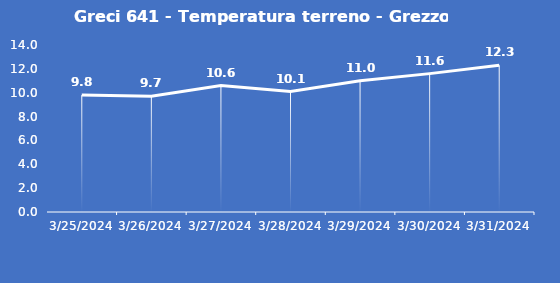
| Category | Greci 641 - Temperatura terreno - Grezzo (°C) |
|---|---|
| 3/25/24 | 9.8 |
| 3/26/24 | 9.7 |
| 3/27/24 | 10.6 |
| 3/28/24 | 10.1 |
| 3/29/24 | 11 |
| 3/30/24 | 11.6 |
| 3/31/24 | 12.3 |